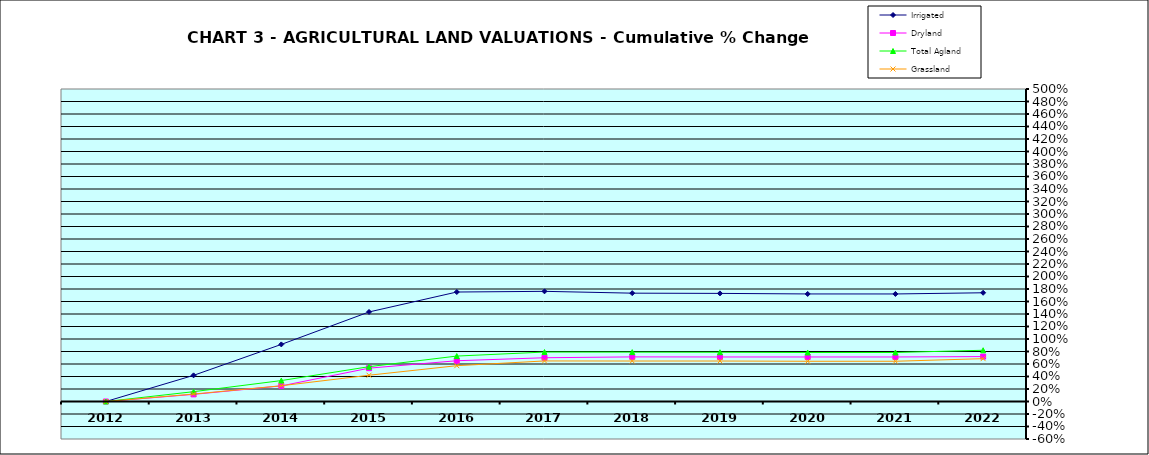
| Category | Irrigated | Dryland | Total Agland | Grassland |
|---|---|---|---|---|
| 2012.0 | 0 | 0 | 0 | 0 |
| 2013.0 | 0.418 | 0.114 | 0.157 | 0.119 |
| 2014.0 | 0.913 | 0.25 | 0.335 | 0.252 |
| 2015.0 | 1.433 | 0.533 | 0.557 | 0.42 |
| 2016.0 | 1.752 | 0.652 | 0.727 | 0.573 |
| 2017.0 | 1.763 | 0.7 | 0.791 | 0.649 |
| 2018.0 | 1.733 | 0.714 | 0.79 | 0.648 |
| 2019.0 | 1.73 | 0.712 | 0.788 | 0.648 |
| 2020.0 | 1.721 | 0.712 | 0.784 | 0.644 |
| 2021.0 | 1.721 | 0.712 | 0.784 | 0.644 |
| 2022.0 | 1.74 | 0.719 | 0.82 | 0.685 |